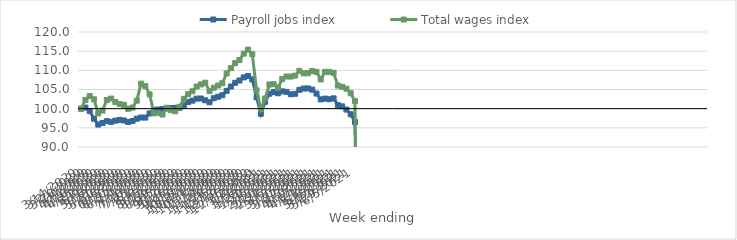
| Category | Payroll jobs index | Total wages index |
|---|---|---|
| 14/03/2020 | 100 | 100 |
| 21/03/2020 | 100.285 | 102.288 |
| 28/03/2020 | 99.388 | 103.294 |
| 04/04/2020 | 97.384 | 102.446 |
| 11/04/2020 | 95.85 | 98.757 |
| 18/04/2020 | 96.272 | 99.504 |
| 25/04/2020 | 96.756 | 102.267 |
| 02/05/2020 | 96.559 | 102.652 |
| 09/05/2020 | 96.882 | 101.744 |
| 16/05/2020 | 97.061 | 101.202 |
| 23/05/2020 | 96.91 | 100.983 |
| 30/05/2020 | 96.518 | 99.969 |
| 06/06/2020 | 96.796 | 100.282 |
| 13/06/2020 | 97.384 | 102.094 |
| 20/06/2020 | 97.688 | 106.525 |
| 27/06/2020 | 97.675 | 105.895 |
| 04/07/2020 | 98.748 | 103.732 |
| 11/07/2020 | 99.714 | 98.76 |
| 18/07/2020 | 99.765 | 98.906 |
| 25/07/2020 | 99.911 | 98.469 |
| 01/08/2020 | 100.02 | 100.239 |
| 08/08/2020 | 100.175 | 99.597 |
| 15/08/2020 | 100.222 | 99.316 |
| 22/08/2020 | 100.232 | 100.452 |
| 29/08/2020 | 100.852 | 102.556 |
| 05/09/2020 | 101.746 | 103.78 |
| 12/09/2020 | 102.101 | 104.533 |
| 19/09/2020 | 102.625 | 105.777 |
| 26/09/2020 | 102.652 | 106.328 |
| 03/10/2020 | 102.186 | 106.77 |
| 10/10/2020 | 101.666 | 104.582 |
| 17/10/2020 | 102.732 | 105.46 |
| 24/10/2020 | 103.104 | 106.032 |
| 31/10/2020 | 103.496 | 106.632 |
| 07/11/2020 | 104.652 | 109.183 |
| 14/11/2020 | 105.786 | 110.571 |
| 21/11/2020 | 106.752 | 111.875 |
| 28/11/2020 | 107.344 | 112.702 |
| 05/12/2020 | 108.155 | 114.356 |
| 12/12/2020 | 108.508 | 115.392 |
| 19/12/2020 | 107.641 | 114.224 |
| 26/12/2020 | 102.97 | 104.786 |
| 02/01/2021 | 98.679 | 99.865 |
| 09/01/2021 | 101.804 | 102.656 |
| 16/01/2021 | 103.902 | 106.32 |
| 23/01/2021 | 104.325 | 106.379 |
| 30/01/2021 | 104.015 | 105.473 |
| 06/02/2021 | 104.516 | 107.713 |
| 13/02/2021 | 104.374 | 108.388 |
| 20/02/2021 | 103.756 | 108.373 |
| 27/02/2021 | 103.877 | 108.617 |
| 06/03/2021 | 104.901 | 109.87 |
| 13/03/2021 | 105.245 | 109.219 |
| 20/03/2021 | 105.285 | 109.246 |
| 27/03/2021 | 104.962 | 109.826 |
| 03/04/2021 | 103.938 | 109.588 |
| 10/04/2021 | 102.412 | 107.63 |
| 17/04/2021 | 102.623 | 109.608 |
| 24/04/2021 | 102.467 | 109.591 |
| 01/05/2021 | 102.691 | 109.356 |
| 08/05/2021 | 100.904 | 106.016 |
| 15/05/2021 | 100.603 | 105.704 |
| 22/05/2021 | 99.763 | 105.205 |
| 29/05/2021 | 98.532 | 104.014 |
| 05/06/2021 | 96.522 | 101.984 |